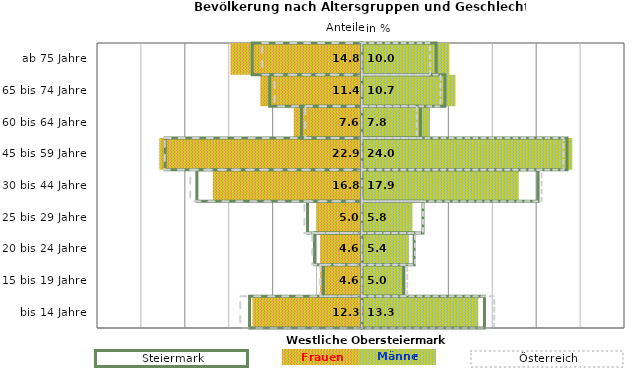
| Category | Frauen | Männer | Frauen Spalte2 | Männer Spalte2 | Frauen Spalte3 | Männer Spalte3 |
|---|---|---|---|---|---|---|
| bis 14 Jahre | -12.3 | 13.3 | 14 | -12.8 | -13.8 | 15.1 |
| 15 bis 19 Jahre | -4.6 | 5 | 4.8 | -4.4 | -4.7 | 5.2 |
| 20 bis 24 Jahre | -4.6 | 5.4 | 6 | -5.4 | -5.6 | 6.1 |
| 25 bis 29 Jahre | -5 | 5.8 | 7 | -6.2 | -6.5 | 7 |
| 30 bis 44 Jahre | -16.8 | 17.9 | 20.1 | -18.8 | -19.5 | 20.5 |
| 45 bis 59 Jahre | -22.9 | 24 | 23.4 | -22.4 | -22.4 | 23 |
| 60 bis 64 Jahre | -7.6 | 7.8 | 6.7 | -6.9 | -6.4 | 6.3 |
| 65 bis 74 Jahre | -11.4 | 10.7 | 9.5 | -10.5 | -9.9 | 9 |
| ab 75 Jahre | -14.8 | 10 | 8.5 | -12.5 | -11.3 | 7.8 |